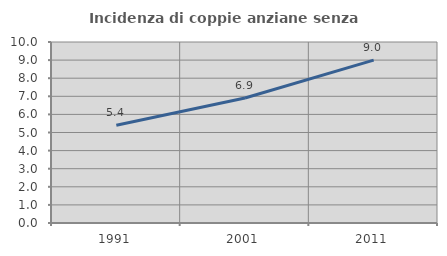
| Category | Incidenza di coppie anziane senza figli  |
|---|---|
| 1991.0 | 5.403 |
| 2001.0 | 6.904 |
| 2011.0 | 9.002 |